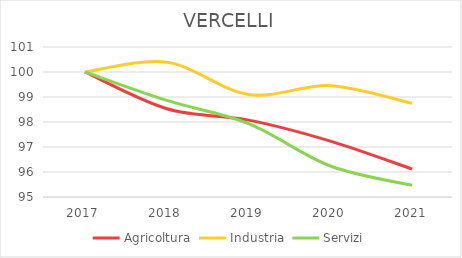
| Category | Agricoltura | Industria | Servizi |
|---|---|---|---|
| 2017.0 | 100 | 100 | 100 |
| 2018.0 | 98.53 | 100.388 | 98.863 |
| 2019.0 | 98.076 | 99.1 | 97.933 |
| 2020.0 | 97.236 | 99.453 | 96.24 |
| 2021.0 | 96.116 | 98.747 | 95.468 |